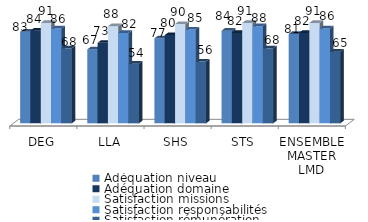
| Category | Adéquation niveau | Adéquation domaine | Satisfaction missions | Satisfaction responsabilités | Satisfaction rémunération |
|---|---|---|---|---|---|
| DEG | 83 | 84 | 91 | 86 | 68 |
| LLA | 67 | 73 | 88 | 82 | 54 |
| SHS | 77 | 80 | 90 | 85 | 56 |
| STS | 84 | 82 | 91 | 88 | 68 |
| ENSEMBLE MASTER LMD | 81 | 82 | 91 | 86 | 65 |